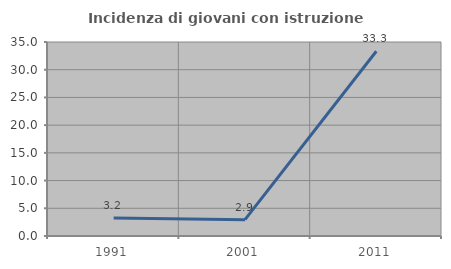
| Category | Incidenza di giovani con istruzione universitaria |
|---|---|
| 1991.0 | 3.226 |
| 2001.0 | 2.941 |
| 2011.0 | 33.333 |